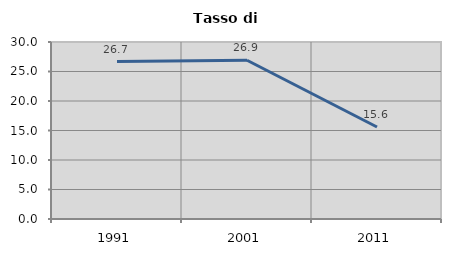
| Category | Tasso di disoccupazione   |
|---|---|
| 1991.0 | 26.695 |
| 2001.0 | 26.909 |
| 2011.0 | 15.596 |